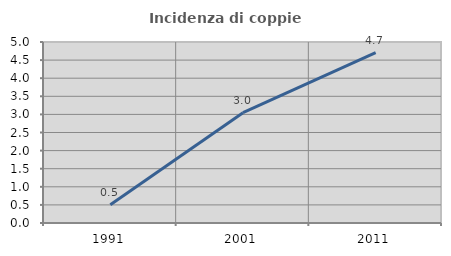
| Category | Incidenza di coppie miste |
|---|---|
| 1991.0 | 0.506 |
| 2001.0 | 3.047 |
| 2011.0 | 4.703 |